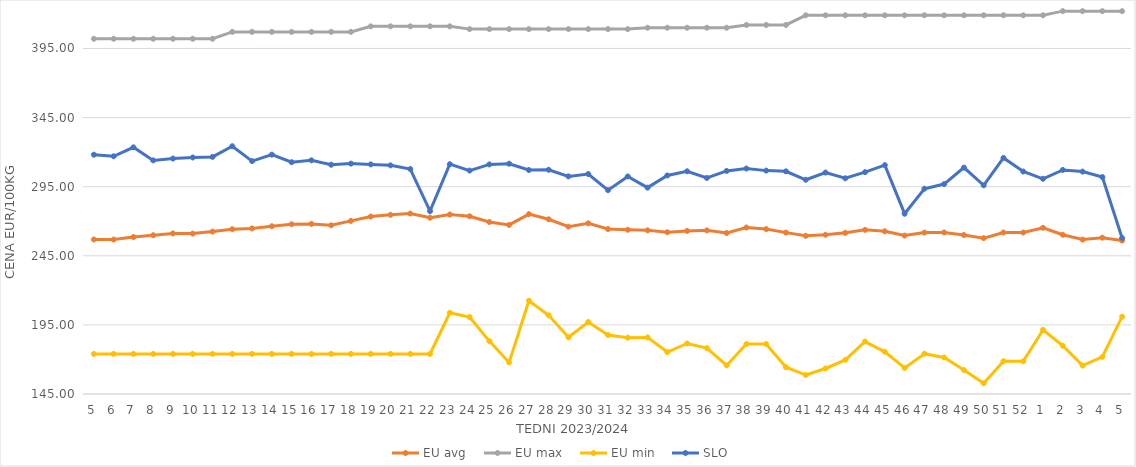
| Category | EU avg | EU max | EU min | SLO |
|---|---|---|---|---|
| 5.0 | 256.808 | 402 | 174 | 318.13 |
| 6.0 | 256.75 | 402 | 174 | 316.99 |
| 7.0 | 258.565 | 402 | 174 | 323.47 |
| 8.0 | 259.872 | 402 | 174 | 314 |
| 9.0 | 261.164 | 402 | 174 | 315.35 |
| 10.0 | 261.06 | 402 | 174 | 316.13 |
| 11.0 | 262.513 | 402 | 174 | 316.55 |
| 12.0 | 264.228 | 407 | 174 | 324.27 |
| 13.0 | 264.768 | 407 | 174 | 313.49 |
| 14.0 | 266.385 | 407 | 174 | 318.17 |
| 15.0 | 267.797 | 407 | 174 | 312.7 |
| 16.0 | 268.021 | 407 | 174 | 314.07 |
| 17.0 | 267.041 | 407 | 174 | 310.87 |
| 18.0 | 270.255 | 407 | 174 | 311.69 |
| 19.0 | 273.406 | 411 | 174 | 311.13 |
| 20.0 | 274.631 | 411 | 174 | 310.42 |
| 21.0 | 275.561 | 411 | 174 | 307.76 |
| 22.0 | 272.542 | 411 | 174 | 277.34 |
| 23.0 | 274.85 | 411 | 203.728 | 311.28 |
| 24.0 | 273.59 | 409 | 200.686 | 306.64 |
| 25.0 | 269.439 | 409 | 183.275 | 311.1 |
| 26.0 | 267.345 | 409 | 167.858 | 311.62 |
| 27.0 | 275.123 | 409 | 212.506 | 307.04 |
| 28.0 | 271.42 | 409 | 201.945 | 307.23 |
| 29.0 | 266.08 | 409 | 186.018 | 302.45 |
| 30.0 | 268.49 | 409 | 197.093 | 304.14 |
| 31.0 | 264.334 | 409 | 187.684 | 292.49 |
| 32.0 | 263.844 | 409 | 185.774 | 302.41 |
| 33.0 | 263.441 | 410 | 185.951 | 294.3 |
| 34.0 | 262.028 | 410 | 175.332 | 303.1 |
| 35.0 | 262.997 | 410 | 181.543 | 306.13 |
| 36.0 | 263.389 | 410 | 178.207 | 301.32 |
| 37.0 | 261.486 | 410 | 165.697 | 306.4 |
| 38.0 | 265.47 | 412 | 181.159 | 308.12 |
| 39.0 | 264.316 | 412 | 181.124 | 306.62 |
| 40.0 | 261.774 | 412 | 164.37 | 306.1 |
| 41.0 | 259.456 | 419 | 158.728 | 300 |
| 42.0 | 260.21 | 419 | 163.464 | 305.24 |
| 43.0 | 261.605 | 419 | 169.66 | 301.07 |
| 44.0 | 263.758 | 419 | 182.925 | 305.52 |
| 45.0 | 262.714 | 419 | 175.524 | 310.58 |
| 46.0 | 259.625 | 419 | 163.882 | 275.46 |
| 47.0 | 261.772 | 419 | 174.136 | 293.51 |
| 48.0 | 261.864 | 419 | 171.4 | 296.9 |
| 49.0 | 260.014 | 419 | 162.336 | 308.8 |
| 50.0 | 257.768 | 419 | 152.762 | 295.97 |
| 51.0 | 261.869 | 419 | 168.739 | 315.82 |
| 52.0 | 261.805 | 419 | 168.659 | 305.97 |
| 1.0 | 265.269 | 419 | 191.406 | 300.71 |
| 2.0 | 260.192 | 422 | 179.926 | 307.09 |
| 3.0 | 256.728 | 422 | 165.575 | 305.92 |
| 4.0 | 258.09 | 422 | 171.865 | 301.97 |
| 5.0 | 255.986 | 422 | 200.926 | 257.83 |